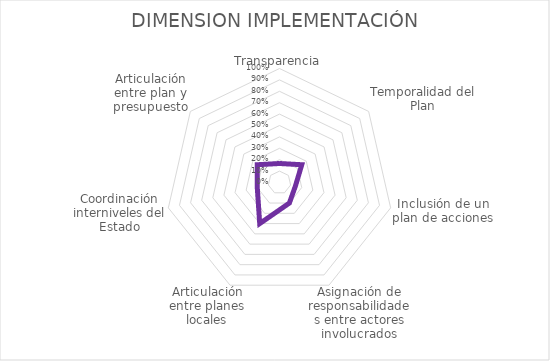
| Category | Series 0 |
|---|---|
| Transparencia | 0.167 |
| Temporalidad del Plan | 0.25 |
| Inclusión de un plan de acciones | 0.143 |
| Asignación de responsabilidades entre actores involucrados | 0.2 |
| Articulación entre planes locales | 0.4 |
| Coordinación interniveles del Estado | 0.2 |
| Articulación entre plan y presupuesto | 0.25 |